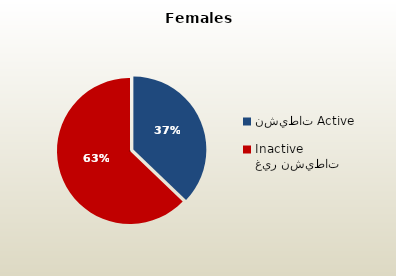
| Category | الاناث القطريات  Qatari Females |
|---|---|
| نشيطات Active | 40287 |
| غير نشيطات Inactive | 68112 |